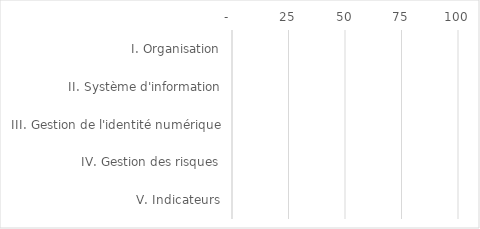
| Category | Series 0 |
|---|---|
| I. Organisation | 0 |
| II. Système d'information | 0 |
| III. Gestion de l'identité numérique | 0 |
| IV. Gestion des risques | 0 |
| V. Indicateurs | 0 |